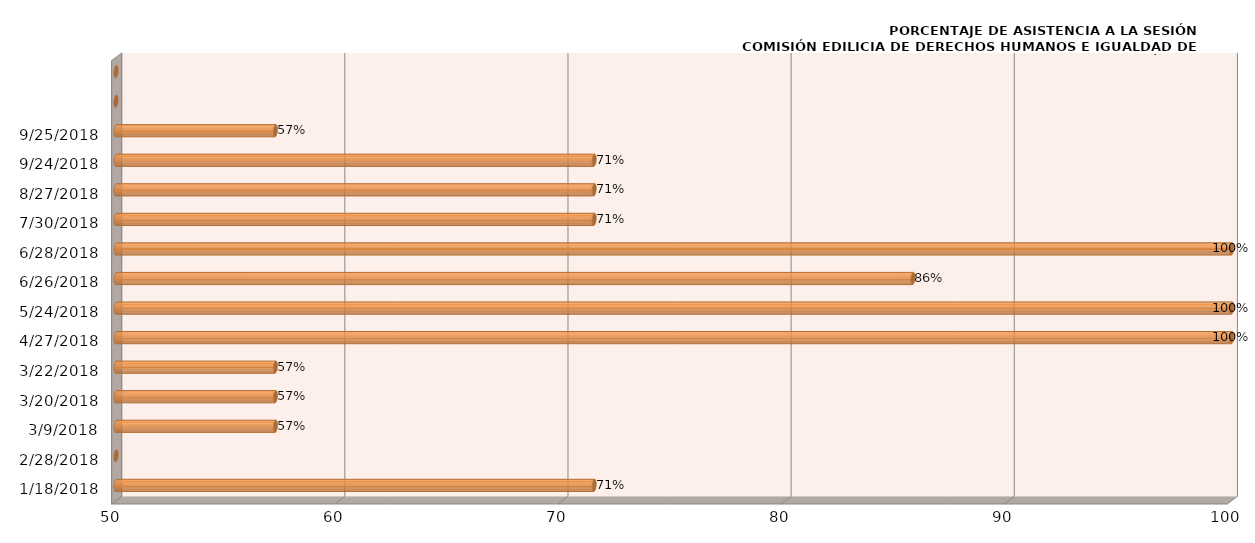
| Category | Series 0 |
|---|---|
| 18/01/2018 | 71.429 |
| 28/02/2018 | 0 |
| 09/03/2018 | 57.143 |
| 20/03/2018 | 57.143 |
| 22/03/2018 | 57.143 |
| 27/04/2018 | 100 |
| 24/05/2018 | 100 |
| 26/06/2018 | 85.714 |
| 28/06/2018 | 100 |
| 30/07/2018 | 71.429 |
| 27/08/2018 | 71.429 |
| 24/09/2018 | 71.429 |
| 25/09/2018 | 57.143 |
| nan | 0 |
| nan | 0 |